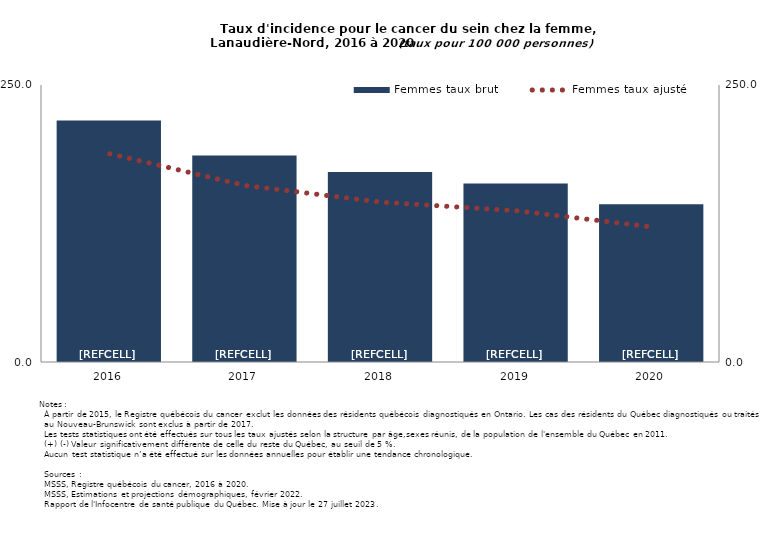
| Category | Femmes taux brut |
|---|---|
| 2016.0 | 217.981 |
| 2017.0 | 186.456 |
| 2018.0 | 171.589 |
| 2019.0 | 161.065 |
| 2020.0 | 142.401 |